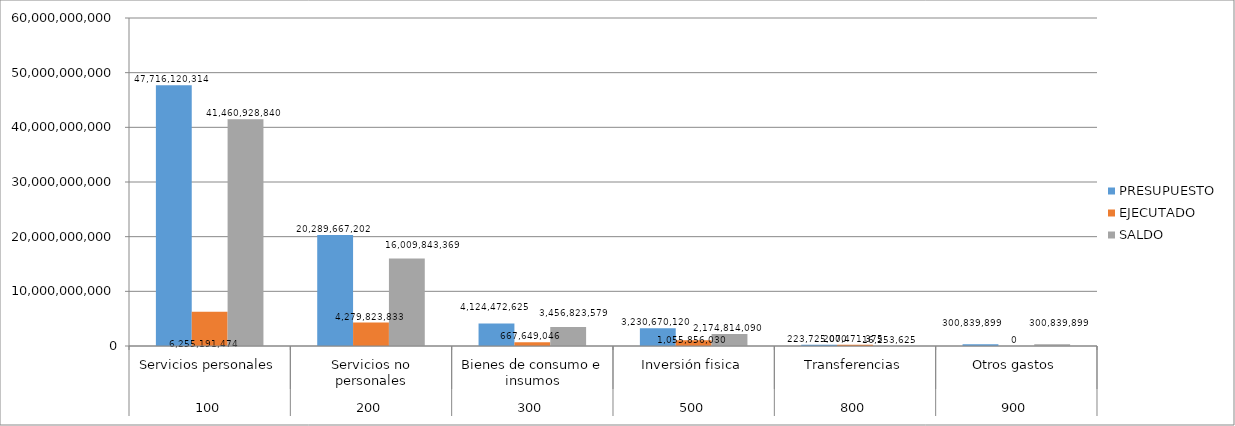
| Category | PRESUPUESTO | EJECUTADO | SALDO |
|---|---|---|---|
| 0 | 47716120314 | 6255191474 | 41460928840 |
| 1 | 20289667202 | 4279823833 | 16009843369 |
| 2 | 4124472625 | 667649046 | 3456823579 |
| 3 | 3230670120 | 1055856030 | 2174814090 |
| 4 | 223725000 | 207471375 | 16253625 |
| 5 | 300839899 | 0 | 300839899 |